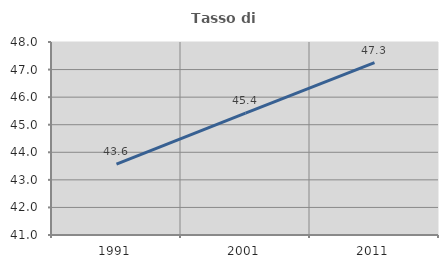
| Category | Tasso di occupazione   |
|---|---|
| 1991.0 | 43.568 |
| 2001.0 | 45.422 |
| 2011.0 | 47.253 |